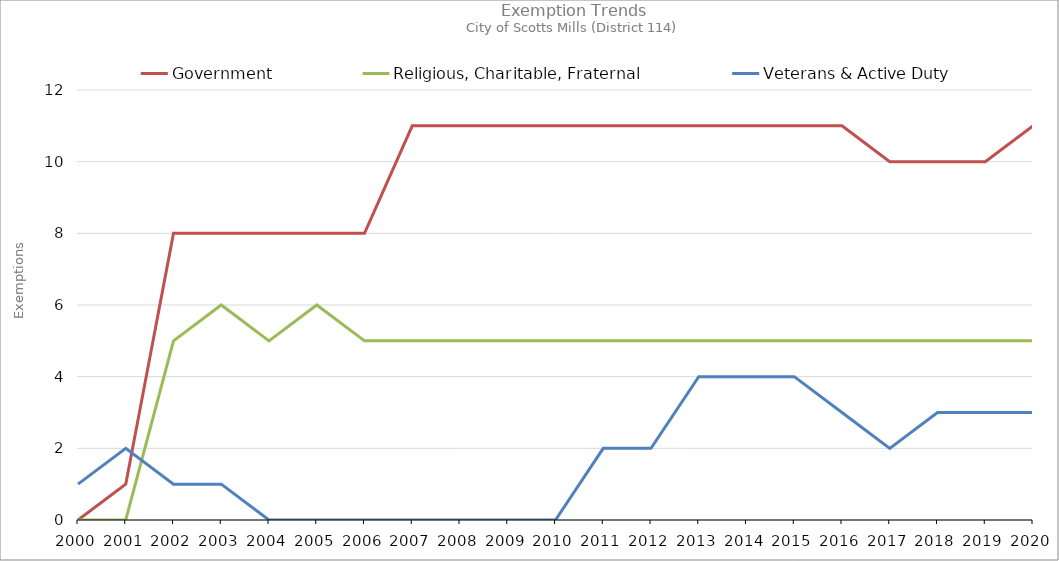
| Category | Government | Religious, Charitable, Fraternal | Veterans & Active Duty |
|---|---|---|---|
| 2000.0 | 0 | 0 | 1 |
| 2001.0 | 1 | 0 | 2 |
| 2002.0 | 8 | 5 | 1 |
| 2003.0 | 8 | 6 | 1 |
| 2004.0 | 8 | 5 | 0 |
| 2005.0 | 8 | 6 | 0 |
| 2006.0 | 8 | 5 | 0 |
| 2007.0 | 11 | 5 | 0 |
| 2008.0 | 11 | 5 | 0 |
| 2009.0 | 11 | 5 | 0 |
| 2010.0 | 11 | 5 | 0 |
| 2011.0 | 11 | 5 | 2 |
| 2012.0 | 11 | 5 | 2 |
| 2013.0 | 11 | 5 | 4 |
| 2014.0 | 11 | 5 | 4 |
| 2015.0 | 11 | 5 | 4 |
| 2016.0 | 11 | 5 | 3 |
| 2017.0 | 10 | 5 | 2 |
| 2018.0 | 10 | 5 | 3 |
| 2019.0 | 10 | 5 | 3 |
| 2020.0 | 11 | 5 | 3 |